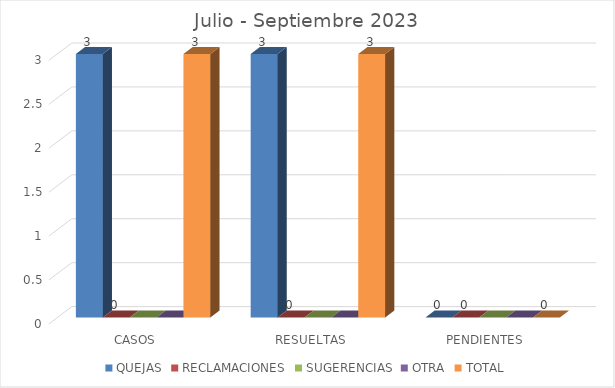
| Category | QUEJAS | RECLAMACIONES | SUGERENCIAS | OTRA | TOTAL |
|---|---|---|---|---|---|
| CASOS | 3 | 0 | 0 | 0 | 3 |
| RESUELTAS | 3 | 0 | 0 | 0 | 3 |
| PENDIENTES | 0 | 0 | 0 | 0 | 0 |